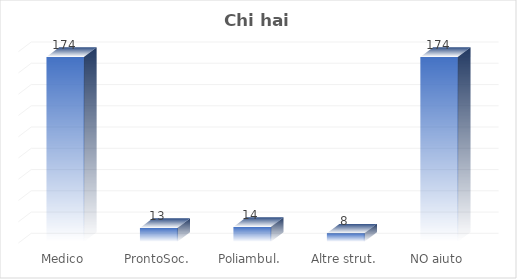
| Category | Chi hai chiamato? |
|---|---|
| Medico | 174 |
| ProntoSoc. | 13 |
| Poliambul. | 14 |
| Altre strut. | 8 |
| NO aiuto | 174 |